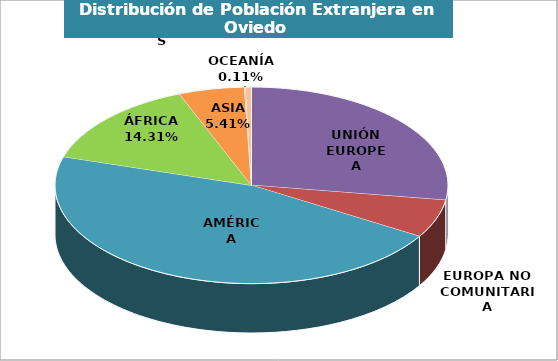
| Category | Series 0 |
|---|---|
| UNIÓN EUROPEA | 4132 |
| EUROPA NO COMUNITARIA | 945 |
| AMÉRICA | 6933 |
| ÁFRICA | 2156 |
| ASIA | 815 |
| OCEANÍA | 16 |
| APÁTRIDAS | 71 |